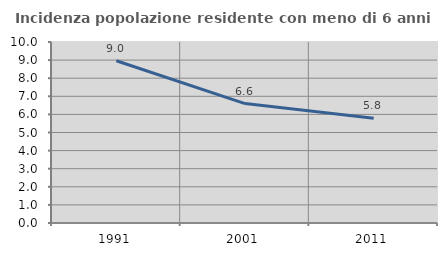
| Category | Incidenza popolazione residente con meno di 6 anni |
|---|---|
| 1991.0 | 8.965 |
| 2001.0 | 6.597 |
| 2011.0 | 5.79 |